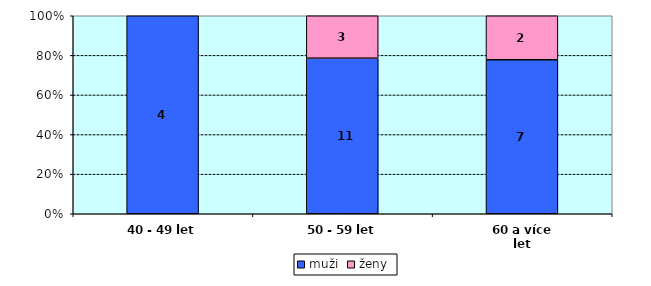
| Category | muži | ženy |
|---|---|---|
| 40 - 49 let | 4 | 0 |
| 50 - 59 let | 11 | 3 |
| 60 a více let | 7 | 2 |